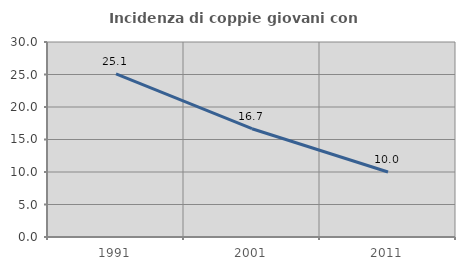
| Category | Incidenza di coppie giovani con figli |
|---|---|
| 1991.0 | 25.092 |
| 2001.0 | 16.657 |
| 2011.0 | 9.994 |